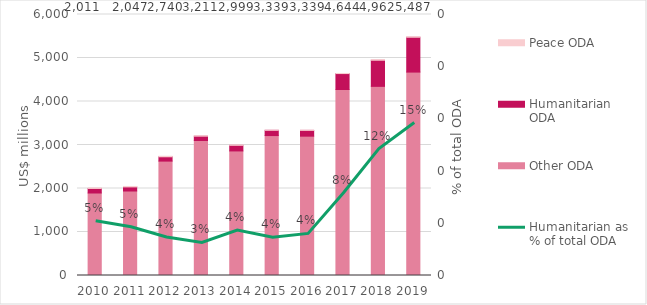
| Category | Other ODA | Humanitarian ODA | Peace ODA |
|---|---|---|---|
| 2010.0 | 1896.599 | 104.59 | 9.385 |
| 2011.0 | 1942.396 | 94.626 | 9.864 |
| 2012.0 | 2629.631 | 99.682 | 11.168 |
| 2013.0 | 3103.239 | 100.074 | 7.403 |
| 2014.0 | 2863.591 | 129.042 | 6.322 |
| 2015.0 | 3216.789 | 120.736 | 1.219 |
| 2016.0 | 3202.986 | 132.992 | 2.718 |
| 2017.0 | 4276.281 | 365.915 | 2.287 |
| 2018.0 | 4348.112 | 600.648 | 13.406 |
| 2019.0 | 4676.113 | 801.244 | 9.673 |